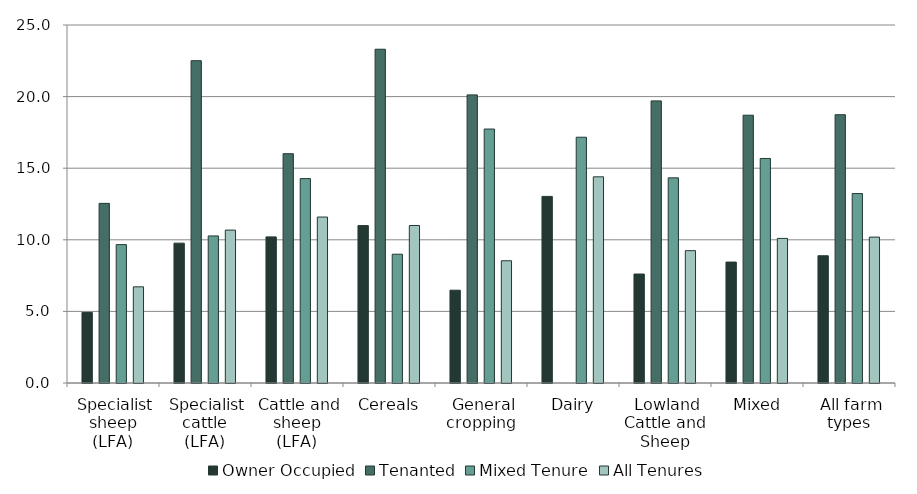
| Category | Owner Occupied | Tenanted | Mixed Tenure | All Tenures |
|---|---|---|---|---|
|  Specialist sheep (LFA) | 4.927 | 12.544 | 9.664 | 6.715 |
|  Specialist cattle (LFA) | 9.766 | 22.507 | 10.27 | 10.676 |
|  Cattle and sheep (LFA) | 10.203 | 16.012 | 14.274 | 11.589 |
|  Cereals | 10.994 | 23.307 | 8.992 | 10.999 |
|  General cropping | 6.481 | 20.12 | 17.735 | 8.536 |
|  Dairy | 13.031 | 0 | 17.163 | 14.398 |
|  Lowland Cattle and Sheep | 7.61 | 19.7 | 14.326 | 9.242 |
|  Mixed | 8.445 | 18.702 | 15.679 | 10.095 |
|  All farm types | 8.886 | 18.735 | 13.229 | 10.187 |